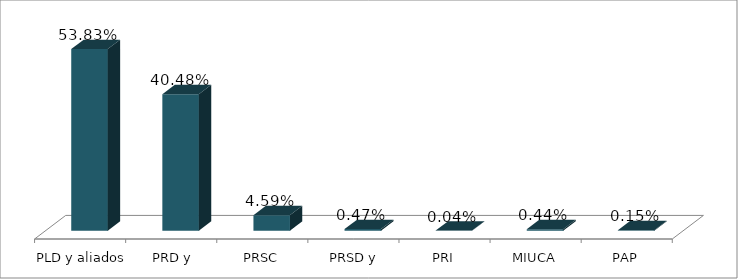
| Category | Votos % |
|---|---|
| PLD y aliados | 0.538 |
| PRD y aliados | 0.405 |
| PRSC | 0.046 |
| PRSD y alidos | 0.005 |
| PRI | 0 |
| MIUCA | 0.004 |
| PAP | 0.001 |